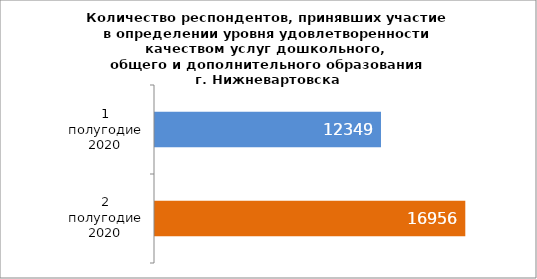
| Category | Series 0 |
|---|---|
| 1 полугодие 2020 | 12349 |
| 2 полугодие 2020 | 16956 |